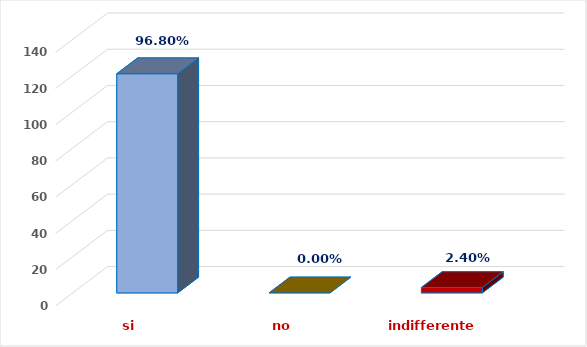
| Category | Series 0 |
|---|---|
| si | 121 |
| no | 0 |
| indifferente | 3 |